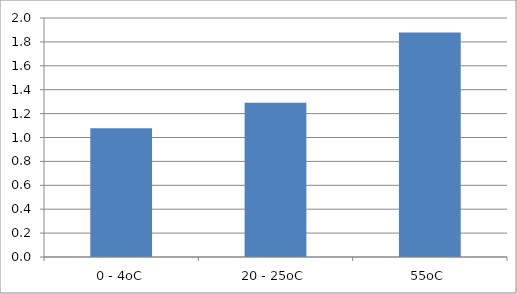
| Category | average |
|---|---|
| 0 - 4oC | 1.076 |
| 20 - 25oC | 1.291 |
| 55oC | 1.879 |